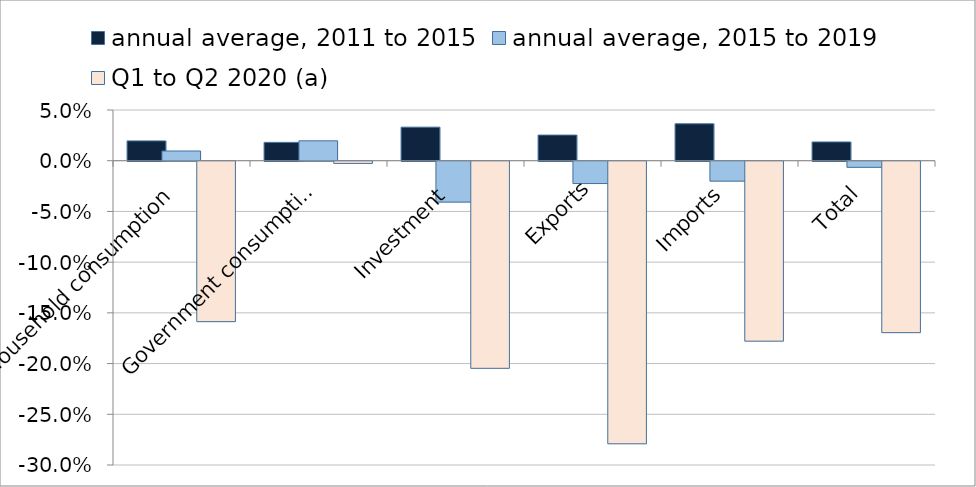
| Category | annual average, 2011 to 2015 | annual average, 2015 to 2019 | Q1 to Q2 2020 (a) |
|---|---|---|---|
| Household consumption | 0.02 | 0.01 | -0.158 |
| Government consumption | 0.018 | 0.02 | -0.002 |
| Investment | 0.033 | -0.04 | -0.204 |
| Exports | 0.025 | -0.022 | -0.279 |
| Imports | 0.036 | -0.02 | -0.177 |
| Total | 0.018 | -0.006 | -0.169 |